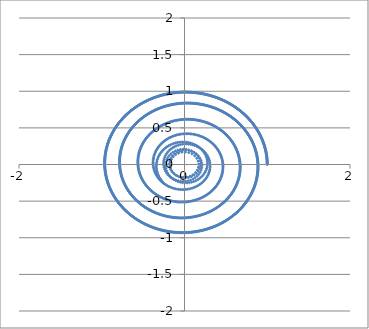
| Category | Series 0 |
|---|---|
| 1.0 | 0 |
| 0.999949643186176 | 0.007 |
| 0.9998489269966271 | 0.014 |
| 0.9996978513534557 | 0.021 |
| 0.9994964186635414 | 0.028 |
| 0.9992446338192059 | 0.035 |
| 0.9989425041987675 | 0.042 |
| 0.9985900396669872 | 0.05 |
| 0.9981872525754041 | 0.057 |
| 0.9977341577625616 | 0.064 |
| 0.9972307725541238 | 0.071 |
| 0.9966771167628822 | 0.078 |
| 0.9960732126886513 | 0.085 |
| 0.9954190851180562 | 0.092 |
| 0.9947147613242082 | 0.099 |
| 0.9939602710662717 | 0.106 |
| 0.9931556465889201 | 0.113 |
| 0.9923009226216816 | 0.12 |
| 0.9913961363781754 | 0.127 |
| 0.9904413275552368 | 0.134 |
| 0.9894365383319326 | 0.141 |
| 0.9883818133684653 | 0.148 |
| 0.9872771998049682 | 0.155 |
| 0.9861227472601889 | 0.162 |
| 0.9849185078300632 | 0.169 |
| 0.983664536086178 | 0.176 |
| 0.982360889074124 | 0.183 |
| 0.9810076263117382 | 0.19 |
| 0.9796048097872353 | 0.197 |
| 0.9781525039572291 | 0.204 |
| 0.9766507757446435 | 0.211 |
| 0.975099694536513 | 0.218 |
| 0.9734993321816721 | 0.225 |
| 0.9718497629883354 | 0.231 |
| 0.9701510637215665 | 0.238 |
| 0.9684033136006366 | 0.245 |
| 0.9666065942962733 | 0.252 |
| 0.964760989927798 | 0.259 |
| 0.9628665870601543 | 0.266 |
| 0.960923474700825 | 0.273 |
| 0.9589317442966395 | 0.279 |
| 0.9568914897304714 | 0.286 |
| 0.9548028073178247 | 0.293 |
| 0.9526657958033112 | 0.3 |
| 0.9504805563570172 | 0.306 |
| 0.9482471925707607 | 0.313 |
| 0.9459658104542383 | 0.32 |
| 0.9436365184310626 | 0.327 |
| 0.9412594273346893 | 0.333 |
| 0.9388346504042355 | 0.34 |
| 0.9363623032801881 | 0.346 |
| 0.933842504000002 | 0.353 |
| 0.9312753729935898 | 0.36 |
| 0.9286610330787017 | 0.366 |
| 0.9259996094561967 | 0.373 |
| 0.9232912297052036 | 0.379 |
| 0.9205360237781742 | 0.386 |
| 0.9177341239958269 | 0.392 |
| 0.9148856650419814 | 0.399 |
| 0.9119907839582855 | 0.405 |
| 0.9090496201388322 | 0.412 |
| 0.9060623153246693 | 0.418 |
| 0.9030290135982003 | 0.425 |
| 0.899949861377477 | 0.431 |
| 0.8968250074103844 | 0.438 |
| 0.8936546027687174 | 0.444 |
| 0.8904388008421499 | 0.45 |
| 0.8871777573320958 | 0.456 |
| 0.8838716302454637 | 0.463 |
| 0.8805205798883027 | 0.469 |
| 0.8771247688593425 | 0.475 |
| 0.8736843620434257 | 0.481 |
| 0.8701995266048331 | 0.488 |
| 0.8666704319805034 | 0.494 |
| 0.863097249873145 | 0.5 |
| 0.8594801542442425 | 0.506 |
| 0.855819321306957 | 0.512 |
| 0.8521149295189201 | 0.518 |
| 0.8483671595749221 | 0.524 |
| 0.8445761943994954 | 0.53 |
| 0.8407422191393914 | 0.536 |
| 0.8368654211559534 | 0.542 |
| 0.8329459900173838 | 0.548 |
| 0.8289841174909066 | 0.554 |
| 0.8249799975348262 | 0.56 |
| 0.8209338262904807 | 0.566 |
| 0.8168458020740921 | 0.571 |
| 0.8127161253685119 | 0.577 |
| 0.8085449988148637 | 0.583 |
| 0.8043326272040823 | 0.589 |
| 0.800079217468349 | 0.594 |
| 0.7957849786724249 | 0.6 |
| 0.7914501220048812 | 0.606 |
| 0.7870748607692267 | 0.611 |
| 0.7826594103749338 | 0.617 |
| 0.7782039883283619 | 0.622 |
| 0.7737088142235798 | 0.628 |
| 0.7691741097330865 | 0.633 |
| 0.7646000985984306 | 0.639 |
| 0.7599870066207293 | 0.644 |
| 0.7553350616510865 | 0.649 |
| 0.7506444935809111 | 0.655 |
| 0.7459155343321346 | 0.66 |
| 0.7411484178473298 | 0.665 |
| 0.7363433800797291 | 0.671 |
| 0.7315006589831451 | 0.676 |
| 0.726620494501791 | 0.681 |
| 0.7217031285600033 | 0.686 |
| 0.7167488050518659 | 0.691 |
| 0.7117577698307368 | 0.696 |
| 0.7067302706986766 | 0.701 |
| 0.7016665573957803 | 0.706 |
| 0.696566881589412 | 0.711 |
| 0.691431496863343 | 0.716 |
| 0.6862606587067933 | 0.721 |
| 0.6810546245033778 | 0.726 |
| 0.6758136535199568 | 0.731 |
| 0.6705380068953907 | 0.735 |
| 0.6652279476292001 | 0.74 |
| 0.6598837405701322 | 0.745 |
| 0.6545056524046314 | 0.75 |
| 0.6490939516452174 | 0.754 |
| 0.6436489086187693 | 0.759 |
| 0.6381707954547169 | 0.763 |
| 0.6326598860731386 | 0.768 |
| 0.6271164561727679 | 0.772 |
| 0.6215407832189074 | 0.777 |
| 0.615933146431251 | 0.781 |
| 0.6102938267716155 | 0.785 |
| 0.604623106931581 | 0.79 |
| 0.5989212713200408 | 0.794 |
| 0.593188606050662 | 0.798 |
| 0.5874253989292554 | 0.802 |
| 0.5816319394410568 | 0.806 |
| 0.57580851873792 | 0.811 |
| 0.5699554296254205 | 0.815 |
| 0.5640729665498713 | 0.819 |
| 0.5581614255852524 | 0.823 |
| 0.5522211044200515 | 0.827 |
| 0.5462523023440191 | 0.83 |
| 0.5402553202348374 | 0.834 |
| 0.5342304605447021 | 0.838 |
| 0.528178027286821 | 0.842 |
| 0.5220983260218254 | 0.846 |
| 0.5159916638440988 | 0.849 |
| 0.5098583493680205 | 0.853 |
| 0.5036986927141262 | 0.856 |
| 0.49751300549518473 | 0.86 |
| 0.4913016008021937 | 0.863 |
| 0.485064793190291 | 0.867 |
| 0.47880289866458603 | 0.87 |
| 0.4725162346659092 | 0.874 |
| 0.46620512005648057 | 0.877 |
| 0.45986987510549854 | 0.88 |
| 0.4535108214746484 | 0.883 |
| 0.4471282822035319 | 0.887 |
| 0.4407225816950179 | 0.89 |
| 0.4342940457005146 | 0.893 |
| 0.4278430013051643 | 0.896 |
| 0.42136977691296035 | 0.899 |
| 0.4148747022317881 | 0.902 |
| 0.40835810825838853 | 0.905 |
| 0.4018203272632473 | 0.908 |
| 0.39526169277540746 | 0.91 |
| 0.38868253956720844 | 0.913 |
| 0.38208320363894993 | 0.916 |
| 0.37546402220348296 | 0.918 |
| 0.3688253336707273 | 0.921 |
| 0.3621674776321163 | 0.924 |
| 0.3554907948449703 | 0.926 |
| 0.3487956272167977 | 0.929 |
| 0.3420823177895256 | 0.931 |
| 0.3353512107236601 | 0.933 |
| 0.3286026512823765 | 0.936 |
| 0.3218369858155403 | 0.938 |
| 0.3150545617436599 | 0.94 |
| 0.30825572754177033 | 0.942 |
| 0.3014408327232503 | 0.945 |
| 0.2946102278235717 | 0.947 |
| 0.28776426438398295 | 0.949 |
| 0.28090329493512634 | 0.951 |
| 0.2740276729805903 | 0.953 |
| 0.2671377529803968 | 0.954 |
| 0.26023389033442523 | 0.956 |
| 0.25331644136577186 | 0.958 |
| 0.2463857633040474 | 0.96 |
| 0.23944221426861173 | 0.961 |
| 0.23248615325174715 | 0.963 |
| 0.22551794010177062 | 0.965 |
| 0.2185379355060855 | 0.966 |
| 0.2115465009741735 | 0.968 |
| 0.20454399882052743 | 0.969 |
| 0.1975307921475255 | 0.97 |
| 0.19050724482824744 | 0.972 |
| 0.1834737214892335 | 0.973 |
| 0.17643058749318677 | 0.974 |
| 0.16937820892161942 | 0.975 |
| 0.1623169525574435 | 0.977 |
| 0.15524718586750705 | 0.978 |
| 0.14816927698507618 | 0.979 |
| 0.1410835946922635 | 0.98 |
| 0.13399050840240403 | 0.981 |
| 0.1268903881423787 | 0.981 |
| 0.1197836045348866 | 0.982 |
| 0.11267052878066622 | 0.983 |
| 0.10555153264066676 | 0.984 |
| 0.09842698841816981 | 0.984 |
| 0.09129726894086235 | 0.985 |
| 0.0841627475428615 | 0.986 |
| 0.077023798046692 | 0.986 |
| 0.06988079474521683 | 0.986 |
| 0.06273411238352179 | 0.987 |
| 0.05558412614075477 | 0.987 |
| 0.04843121161192022 | 0.988 |
| 0.0412757447896298 | 0.988 |
| 0.03411810204580966 | 0.988 |
| 0.026958660113365143 | 0.988 |
| 0.019797796067803686 | 0.988 |
| 0.012635887308816507 | 0.988 |
| 0.00547331154181989 | 0.988 |
| -0.001689553240543264 | 0.988 |
| -0.008852328776940893 | 0.988 |
| -0.016014636555927494 | 0.988 |
| -0.023176097834557423 | 0.988 |
| -0.030336333657034982 | 0.987 |
| -0.037494964873400635 | 0.987 |
| -0.04465161215825255 | 0.987 |
| -0.05180589602950279 | 0.986 |
| -0.05895743686716735 | 0.986 |
| -0.06610585493218932 | 0.985 |
| -0.0732507703852945 | 0.985 |
| -0.08039180330587856 | 0.984 |
| -0.08752857371092514 | 0.983 |
| -0.09466070157395405 | 0.982 |
| -0.10178780684399885 | 0.982 |
| -0.108909509464613 | 0.981 |
| -0.11602542939290392 | 0.98 |
| -0.123135186618594 | 0.979 |
| -0.1302384011831081 | 0.978 |
| -0.1373346931986863 | 0.977 |
| -0.14442368286752172 | 0.976 |
| -0.15150499050092203 | 0.975 |
| -0.15857823653849434 | 0.973 |
| -0.16564304156735238 | 0.972 |
| -0.17269902634134532 | 0.971 |
| -0.17974581180030746 | 0.969 |
| -0.18678301908932793 | 0.968 |
| -0.19381026957803957 | 0.967 |
| -0.20082718487992635 | 0.965 |
| -0.2078333868716483 | 0.963 |
| -0.21482849771238338 | 0.962 |
| -0.22181213986318538 | 0.96 |
| -0.22878393610635686 | 0.958 |
| -0.23574350956483678 | 0.957 |
| -0.24269048372160143 | 0.955 |
| -0.2496244824390784 | 0.953 |
| -0.2565451299785722 | 0.951 |
| -0.2634520510197013 | 0.949 |
| -0.2703448706798454 | 0.947 |
| -0.277223214533602 | 0.945 |
| -0.2840867086322517 | 0.943 |
| -0.2909349795232317 | 0.941 |
| -0.29776765426961566 | 0.938 |
| -0.3045843604695999 | 0.936 |
| -0.3113847262759954 | 0.934 |
| -0.31816838041572343 | 0.931 |
| -0.3249349522093156 | 0.929 |
| -0.33168407159041613 | 0.926 |
| -0.3384153691252861 | 0.924 |
| -0.34512847603230923 | 0.921 |
| -0.3518230242014973 | 0.919 |
| -0.35849864621399535 | 0.916 |
| -0.36515497536158503 | 0.913 |
| -0.371791645666186 | 0.91 |
| -0.3784082918993537 | 0.908 |
| -0.38500454960177344 | 0.905 |
| -0.3915800551027492 | 0.902 |
| -0.3981344455396868 | 0.899 |
| -0.4046673588775703 | 0.896 |
| -0.411178433928431 | 0.893 |
| -0.4176673103708077 | 0.889 |
| -0.4241336287691978 | 0.886 |
| -0.43057703059349856 | 0.883 |
| -0.43699715823843654 | 0.88 |
| -0.4433936550429858 | 0.876 |
| -0.44976616530977265 | 0.873 |
| -0.4561143343244674 | 0.87 |
| -0.4624378083751607 | 0.866 |
| -0.46873623477172477 | 0.863 |
| -0.4750092618651584 | 0.859 |
| -0.48125653906691424 | 0.856 |
| -0.4874777168682081 | 0.852 |
| -0.49367244685930933 | 0.848 |
| -0.4998403817488108 | 0.844 |
| -0.5059811753828783 | 0.841 |
| -0.5120944827644783 | 0.837 |
| -0.5181799600725824 | 0.833 |
| -0.5242372646813485 | 0.829 |
| -0.5302660551792777 | 0.825 |
| -0.5362659913883457 | 0.821 |
| -0.5422367343831074 | 0.817 |
| -0.5481779465097745 | 0.813 |
| -0.5540892914052652 | 0.809 |
| -0.5599704340162246 | 0.805 |
| -0.5658210406180149 | 0.8 |
| -0.571640778833675 | 0.796 |
| -0.5774293176528482 | 0.792 |
| -0.5831863274506767 | 0.787 |
| -0.588911480006663 | 0.783 |
| -0.5946044485234969 | 0.779 |
| -0.6002649076458454 | 0.774 |
| -0.6058925334791082 | 0.77 |
| -0.6114870036081346 | 0.765 |
| -0.6170479971159019 | 0.76 |
| -0.6225751946021553 | 0.756 |
| -0.6280682782020073 | 0.751 |
| -0.6335269316044956 | 0.746 |
| -0.6389508400710996 | 0.741 |
| -0.6443396904542132 | 0.737 |
| -0.6496931712155743 | 0.732 |
| -0.655010972444649 | 0.727 |
| -0.66029278587697 | 0.722 |
| -0.6655383049124288 | 0.717 |
| -0.6707472246335192 | 0.712 |
| -0.675919241823533 | 0.707 |
| -0.6810540549847061 | 0.702 |
| -0.6861513643563132 | 0.697 |
| -0.6912108719327124 | 0.691 |
| -0.6962322814813361 | 0.686 |
| -0.7012152985606291 | 0.681 |
| -0.7061596305379327 | 0.676 |
| -0.711064986607313 | 0.67 |
| -0.7159310778073329 | 0.665 |
| -0.7207576170387677 | 0.66 |
| -0.725544319082262 | 0.654 |
| -0.7302909006159275 | 0.649 |
| -0.734997080232881 | 0.643 |
| -0.7396625784587217 | 0.638 |
| -0.7442871177689461 | 0.632 |
| -0.7488704226062998 | 0.626 |
| -0.7534122193980665 | 0.621 |
| -0.7579122365732914 | 0.615 |
| -0.7623702045799393 | 0.609 |
| -0.7667858559019853 | 0.604 |
| -0.771158925076439 | 0.598 |
| -0.7754891487102991 | 0.592 |
| -0.7797762654974386 | 0.586 |
| -0.7840200162354207 | 0.58 |
| -0.7882201438422414 | 0.574 |
| -0.7923763933730006 | 0.568 |
| -0.7964885120365004 | 0.562 |
| -0.800556249211768 | 0.556 |
| -0.804579356464504 | 0.55 |
| -0.8085575875634539 | 0.544 |
| -0.8124906984967033 | 0.538 |
| -0.8163784474878941 | 0.532 |
| -0.820220595012362 | 0.526 |
| -0.8240169038131936 | 0.52 |
| -0.8277671389172031 | 0.513 |
| -0.8314710676508265 | 0.507 |
| -0.8351284596559329 | 0.501 |
| -0.8387390869055522 | 0.495 |
| -0.8423027237195179 | 0.488 |
| -0.8458191467800236 | 0.482 |
| -0.8492881351470936 | 0.475 |
| -0.8527094702739652 | 0.469 |
| -0.8560829360223826 | 0.463 |
| -0.859408318677801 | 0.456 |
| -0.8626854069645002 | 0.45 |
| -0.8659139920606073 | 0.443 |
| -0.8690938676130252 | 0.437 |
| -0.8722248297522702 | 0.43 |
| -0.8753066771072133 | 0.423 |
| -0.8783392108197267 | 0.417 |
| -0.8813222345592342 | 0.41 |
| -0.8842555545371648 | 0.403 |
| -0.8871389795213072 | 0.397 |
| -0.889972320850066 | 0.39 |
| -0.8927553924466173 | 0.383 |
| -0.895488010832964 | 0.377 |
| -0.8981699951438885 | 0.37 |
| -0.9008011671408026 | 0.363 |
| -0.9033813512254942 | 0.356 |
| -0.9059103744537687 | 0.349 |
| -0.9083880665489845 | 0.342 |
| -0.9108142599154831 | 0.336 |
| -0.9131887896519099 | 0.329 |
| -0.9155114935644276 | 0.322 |
| -0.9177822121798204 | 0.315 |
| -0.9200007887584868 | 0.308 |
| -0.9221670693073222 | 0.301 |
| -0.9242809025924884 | 0.294 |
| -0.9263421401520706 | 0.287 |
| -0.9283506363086201 | 0.28 |
| -0.9303062481815818 | 0.273 |
| -0.932208835699606 | 0.266 |
| -0.9340582616127435 | 0.259 |
| -0.9358543915045227 | 0.252 |
| -0.9375970938039077 | 0.245 |
| -0.9392862397971378 | 0.238 |
| -0.9409217036394456 | 0.23 |
| -0.9425033623666541 | 0.223 |
| -0.9440310959066509 | 0.216 |
| -0.9455047870907403 | 0.209 |
| -0.9469243216648697 | 0.202 |
| -0.948289588300733 | 0.195 |
| -0.9496004786067455 | 0.187 |
| -0.9508568871388944 | 0.18 |
| -0.9520587114114598 | 0.173 |
| -0.9532058519076082 | 0.166 |
| -0.9542982120898555 | 0.159 |
| -0.9553356984104004 | 0.151 |
| -0.9563182203213261 | 0.144 |
| -0.9572456902846695 | 0.137 |
| -0.9581180237823583 | 0.129 |
| -0.9589351393260127 | 0.122 |
| -0.9596969584666136 | 0.115 |
| -0.9604034058040345 | 0.108 |
| -0.9610544089964362 | 0.1 |
| -0.9616498987695256 | 0.093 |
| -0.9621898089256742 | 0.086 |
| -0.9626740763528994 | 0.078 |
| -0.9631026410337038 | 0.071 |
| -0.9634754460537754 | 0.064 |
| -0.9637924376105446 | 0.056 |
| -0.964053565021599 | 0.049 |
| -0.9642587807329555 | 0.042 |
| -0.9644080403271866 | 0.034 |
| -0.9645013025314032 | 0.027 |
| -0.9645385292250898 | 0.02 |
| -0.9645196854477935 | 0.012 |
| -0.9644447394066664 | 0.005 |
| -0.9643136624838572 | -0.002 |
| -0.9641264292437555 | -0.01 |
| -0.9638830174400848 | -0.017 |
| -0.963583408022845 | -0.024 |
| -0.9632275851451031 | -0.032 |
| -0.9628155361696307 | -0.039 |
| -0.9623472516753888 | -0.046 |
| -0.9618227254638582 | -0.054 |
| -0.9612419545652141 | -0.061 |
| -0.9606049392443462 | -0.068 |
| -0.9599116830067209 | -0.076 |
| -0.9591621926040869 | -0.083 |
| -0.958356478040022 | -0.09 |
| -0.9574945525753217 | -0.097 |
| -0.9565764327332269 | -0.105 |
| -0.9556021383044923 | -0.112 |
| -0.9545716923522923 | -0.119 |
| -0.9534851212169657 | -0.127 |
| -0.9523424545205972 | -0.134 |
| -0.9511437251714349 | -0.141 |
| -0.9498889693681444 | -0.148 |
| -0.9485782266038969 | -0.156 |
| -0.9472115396702918 | -0.163 |
| -0.9457889546611128 | -0.17 |
| -0.9443105209759164 | -0.177 |
| -0.9427762913234526 | -0.185 |
| -0.9411863217249167 | -0.192 |
| -0.9395406715170311 | -0.199 |
| -0.9378394033549583 | -0.206 |
| -0.9360825832150411 | -0.213 |
| -0.9342702803973726 | -0.22 |
| -0.9324025675281931 | -0.228 |
| -0.9304795205621141 | -0.235 |
| -0.9285012187841691 | -0.242 |
| -0.9264677448116889 | -0.249 |
| -0.9243791845960028 | -0.256 |
| -0.9222356274239634 | -0.263 |
| -0.9200371659192953 | -0.27 |
| -0.9177838960437668 | -0.277 |
| -0.9154759170981829 | -0.284 |
| -0.9131133317232013 | -0.291 |
| -0.9106962458999682 | -0.298 |
| -0.9082247689505748 | -0.305 |
| -0.9056990135383333 | -0.312 |
| -0.903119095667872 | -0.319 |
| -0.9004851346850489 | -0.326 |
| -0.897797253276683 | -0.333 |
| -0.8950555774701024 | -0.34 |
| -0.8922602366325094 | -0.346 |
| -0.8894113634701611 | -0.353 |
| -0.8865090940273661 | -0.36 |
| -0.8835535676852949 | -0.367 |
| -0.8805449271606053 | -0.374 |
| -0.877483318503881 | -0.38 |
| -0.8743688910978831 | -0.387 |
| -0.8712017976556146 | -0.394 |
| -0.8679821942181962 | -0.4 |
| -0.8647102401525538 | -0.407 |
| -0.8613860981489165 | -0.414 |
| -0.8580099342181252 | -0.42 |
| -0.8545819176887505 | -0.427 |
| -0.8511022212040203 | -0.433 |
| -0.8475710207185558 | -0.44 |
| -0.8439884954949154 | -0.446 |
| -0.8403548280999467 | -0.453 |
| -0.8366702044009454 | -0.459 |
| -0.8329348135616215 | -0.466 |
| -0.8291488480378703 | -0.472 |
| -0.8253125035733505 | -0.478 |
| -0.821425979194867 | -0.485 |
| -0.8174894772075583 | -0.491 |
| -0.8135032031898882 | -0.497 |
| -0.8094673659884424 | -0.504 |
| -0.8053821777125265 | -0.51 |
| -0.8012478537285694 | -0.516 |
| -0.7970646126543274 | -0.522 |
| -0.7928326763528911 | -0.528 |
| -0.7885522699264947 | -0.534 |
| -0.7842236217101255 | -0.54 |
| -0.779846963264935 | -0.546 |
| -0.7754225293714506 | -0.552 |
| -0.7709505580225875 | -0.558 |
| -0.7664312904164601 | -0.564 |
| -0.7618649709489929 | -0.57 |
| -0.7572518472063311 | -0.576 |
| -0.7525921699570491 | -0.582 |
| -0.7478861931441583 | -0.587 |
| -0.7431341738769118 | -0.593 |
| -0.7383363724224086 | -0.599 |
| -0.7334930521969932 | -0.605 |
| -0.7286044797574546 | -0.61 |
| -0.7236709247920199 | -0.616 |
| -0.7186926601111464 | -0.621 |
| -0.7136699616381088 | -0.627 |
| -0.7086031083993829 | -0.632 |
| -0.7034923825148248 | -0.638 |
| -0.6983380691876463 | -0.643 |
| -0.6931404566941846 | -0.648 |
| -0.6878998363734677 | -0.654 |
| -0.6826165026165748 | -0.659 |
| -0.6772907528557904 | -0.664 |
| -0.6719228875535541 | -0.669 |
| -0.6665132101912031 | -0.675 |
| -0.6610620272575102 | -0.68 |
| -0.6555696482370146 | -0.685 |
| -0.650036385598147 | -0.69 |
| -0.644462554781148 | -0.695 |
| -0.6388484741857796 | -0.7 |
| -0.6331944651588303 | -0.705 |
| -0.6275008519814134 | -0.709 |
| -0.6217679618560579 | -0.714 |
| -0.6159961248935927 | -0.719 |
| -0.610185674099823 | -0.724 |
| -0.6043369453620004 | -0.728 |
| -0.5984502774350844 | -0.733 |
| -0.5925260119277971 | -0.737 |
| -0.5865644932884707 | -0.742 |
| -0.580566068790687 | -0.746 |
| -0.5745310885187088 | -0.751 |
| -0.5684599053527052 | -0.755 |
| -0.5623528749537674 | -0.76 |
| -0.5562103557487187 | -0.764 |
| -0.5500327089147151 | -0.768 |
| -0.5438202983636399 | -0.772 |
| -0.5375734907262891 | -0.776 |
| -0.5312926553363511 | -0.781 |
| -0.5249781642141769 | -0.785 |
| -0.5186303920503446 | -0.789 |
| -0.5122497161890152 | -0.793 |
| -0.505836516611082 | -0.796 |
| -0.4993911759171124 | -0.8 |
| -0.4929140793100825 | -0.804 |
| -0.48640561457790504 | -0.808 |
| -0.4798661720757502 | -0.812 |
| -0.47329614470816 | -0.815 |
| -0.46669592791095565 | -0.819 |
| -0.460065919632939 | -0.822 |
| -0.4534065203173875 | -0.826 |
| -0.44671813288334294 | -0.829 |
| -0.44000116270669487 | -0.833 |
| -0.43325601760105775 | -0.836 |
| -0.4264831077984432 | -0.839 |
| -0.4196828459297266 | -0.842 |
| -0.41285564700490923 | -0.846 |
| -0.4060019283931752 | -0.849 |
| -0.39912210980274454 | -0.852 |
| -0.3922166132605214 | -0.855 |
| -0.3852858630915392 | -0.858 |
| -0.37833028589820183 | -0.861 |
| -0.37135031053932144 | -0.863 |
| -0.3643463681089537 | -0.866 |
| -0.35731889191503047 | -0.869 |
| -0.35026831745779 | -0.872 |
| -0.34319508240800567 | -0.874 |
| -0.33609962658501286 | -0.877 |
| -0.3289823919345352 | -0.879 |
| -0.32184382250630994 | -0.882 |
| -0.3146843644315131 | -0.884 |
| -0.307504465899985 | -0.886 |
| -0.30030457713725606 | -0.889 |
| -0.2930851503813743 | -0.891 |
| -0.2858466398595338 | -0.893 |
| -0.27858950176450575 | -0.895 |
| -0.2713141942308719 | -0.897 |
| -0.2640211773110608 | -0.899 |
| -0.25671091295118814 | -0.901 |
| -0.24938386496670095 | -0.903 |
| -0.24204049901782657 | -0.905 |
| -0.2346812825848269 | -0.906 |
| -0.2273066849430585 | -0.908 |
| -0.21991717713783912 | -0.91 |
| -0.21251323195912133 | -0.911 |
| -0.20509532391597382 | -0.913 |
| -0.19766392921087095 | -0.914 |
| -0.1902195257137914 | -0.916 |
| -0.18276259293612626 | -0.917 |
| -0.1752936120043977 | -0.918 |
| -0.1678130656337883 | -0.919 |
| -0.16032143810148244 | -0.92 |
| -0.15281921521981987 | -0.922 |
| -0.1453068843092625 | -0.923 |
| -0.1377849341711753 | -0.923 |
| -0.13025385506042156 | -0.924 |
| -0.12271413865777393 | -0.925 |
| -0.11516627804214147 | -0.926 |
| -0.10761076766261392 | -0.927 |
| -0.10004810331032381 | -0.927 |
| -0.09247878209012733 | -0.928 |
| -0.08490330239210472 | -0.928 |
| -0.07732216386288122 | -0.929 |
| -0.06973586737676922 | -0.929 |
| -0.06214491500673277 | -0.93 |
| -0.05454980999517519 | -0.93 |
| -0.04695105672455075 | -0.93 |
| -0.03934916068780139 | -0.93 |
| -0.03174462845861943 | -0.93 |
| -0.024137967661537207 | -0.93 |
| -0.0165296869418447 | -0.93 |
| -0.008920295935336109 | -0.93 |
| -0.0013103052378863628 | -0.93 |
| 0.0062997736251412945 | -0.93 |
| 0.013909428229655683 | -0.93 |
| 0.021518145283764938 | -0.929 |
| 0.029125410658869515 | -0.929 |
| 0.036730709420919896 | -0.928 |
| 0.04433352586183784 | -0.928 |
| 0.0519333435311001 | -0.927 |
| 0.059529645267483375 | -0.927 |
| 0.06712191323096942 | -0.926 |
| 0.07470962893480906 | -0.925 |
| 0.08229227327774402 | -0.924 |
| 0.0898693265763852 | -0.923 |
| 0.0974402685977463 | -0.922 |
| 0.10500457859193146 | -0.921 |
| 0.11256173532497582 | -0.92 |
| 0.12011121711183743 | -0.919 |
| 0.12765250184953952 | -0.918 |
| 0.13518506705046157 | -0.916 |
| 0.1427083898757781 | -0.915 |
| 0.15022194716904366 | -0.914 |
| 0.15772521548992258 | -0.912 |
| 0.1652176711480624 | -0.911 |
| 0.1726987902371094 | -0.909 |
| 0.1801680486688647 | -0.907 |
| 0.1876249222075798 | -0.906 |
| 0.19506888650438978 | -0.904 |
| 0.2024994171318831 | -0.902 |
| 0.2099159896188061 | -0.9 |
| 0.21731807948490095 | -0.898 |
| 0.22470516227587567 | -0.896 |
| 0.23207671359850418 | -0.894 |
| 0.23943220915585542 | -0.892 |
| 0.2467711247826497 | -0.89 |
| 0.25409293648074066 | -0.887 |
| 0.26139712045472124 | -0.885 |
| 0.2686831531476524 | -0.883 |
| 0.2759505112769123 | -0.88 |
| 0.2831986718701648 | -0.878 |
| 0.2904271123014458 | -0.875 |
| 0.29763531032736484 | -0.872 |
| 0.30482274412342136 | -0.87 |
| 0.31198889232043286 | -0.867 |
| 0.31913323404107435 | -0.864 |
| 0.3262552489365262 | -0.861 |
| 0.3333544172232294 | -0.858 |
| 0.3404302197197461 | -0.855 |
| 0.3474821378837238 | -0.852 |
| 0.3545096538489612 | -0.849 |
| 0.36151225046257407 | -0.846 |
| 0.3684894113222588 | -0.843 |
| 0.3754406208136527 | -0.839 |
| 0.382365364147788 | -0.836 |
| 0.3892631273986385 | -0.832 |
| 0.3961333975407567 | -0.829 |
| 0.4029756624869992 | -0.825 |
| 0.40978941112633865 | -0.822 |
| 0.4165741333617605 | -0.818 |
| 0.4233293201482419 | -0.814 |
| 0.4300544635308113 | -0.811 |
| 0.4367490566826865 | -0.807 |
| 0.4434125939434892 | -0.803 |
| 0.4500445708575338 | -0.799 |
| 0.45664448421218834 | -0.795 |
| 0.46321183207630584 | -0.791 |
| 0.46974611383872356 | -0.787 |
| 0.47624683024682807 | -0.782 |
| 0.48271348344518394 | -0.778 |
| 0.4891455770142244 | -0.774 |
| 0.4955426160090007 | -0.77 |
| 0.5019041069979892 | -0.765 |
| 0.5082295581019527 | -0.761 |
| 0.5145184790328553 | -0.756 |
| 0.5207703811328266 | -0.752 |
| 0.5269847774131746 | -0.747 |
| 0.5331611825934444 | -0.742 |
| 0.5392991131405196 | -0.738 |
| 0.5453980873077662 | -0.733 |
| 0.5514576251742137 | -0.728 |
| 0.5574772486837736 | -0.723 |
| 0.563456481684491 | -0.718 |
| 0.5693948499678292 | -0.713 |
| 0.5752918813079813 | -0.708 |
| 0.5811471055012105 | -0.703 |
| 0.5869600544052135 | -0.698 |
| 0.5927302619785055 | -0.693 |
| 0.5984572643198252 | -0.687 |
| 0.6041405997075553 | -0.682 |
| 0.6097798086391588 | -0.677 |
| 0.6153744338706251 | -0.671 |
| 0.6209240204559261 | -0.666 |
| 0.6264281157864788 | -0.66 |
| 0.6318862696306112 | -0.655 |
| 0.6372980341730295 | -0.649 |
| 0.642662964054284 | -0.644 |
| 0.6479806164102306 | -0.638 |
| 0.653250550911486 | -0.632 |
| 0.6584723298028722 | -0.626 |
| 0.6636455179428502 | -0.621 |
| 0.6687696828429378 | -0.615 |
| 0.6738443947071098 | -0.609 |
| 0.6788692264711774 | -0.603 |
| 0.6838437538421456 | -0.597 |
| 0.6887675553375422 | -0.591 |
| 0.6936402123247202 | -0.585 |
| 0.6984613090601268 | -0.579 |
| 0.7032304327285387 | -0.572 |
| 0.7079471734822589 | -0.566 |
| 0.7126111244802742 | -0.56 |
| 0.7172218819273687 | -0.554 |
| 0.721779045113191 | -0.547 |
| 0.7262822164512726 | -0.541 |
| 0.7307310015179934 | -0.534 |
| 0.7351250090914931 | -0.528 |
| 0.7394638511905235 | -0.521 |
| 0.7437471431132398 | -0.515 |
| 0.7479745034759283 | -0.508 |
| 0.7521455542516662 | -0.502 |
| 0.756259920808911 | -0.495 |
| 0.7603172319500174 | -0.488 |
| 0.7643171199496765 | -0.482 |
| 0.7682592205932762 | -0.475 |
| 0.7721431732151784 | -0.468 |
| 0.7759686207369109 | -0.461 |
| 0.779735209705269 | -0.454 |
| 0.7834425903303265 | -0.447 |
| 0.78709041652335 | -0.44 |
| 0.7906783459346147 | -0.433 |
| 0.7942060399911189 | -0.426 |
| 0.7976731639341925 | -0.419 |
| 0.801079386856998 | -0.412 |
| 0.8044243817419189 | -0.405 |
| 0.8077078254978338 | -0.398 |
| 0.8109293989972719 | -0.391 |
| 0.8140887871134467 | -0.384 |
| 0.8171856787571651 | -0.376 |
| 0.8202197669136079 | -0.369 |
| 0.8231907486789787 | -0.362 |
| 0.8260983252970177 | -0.355 |
| 0.8289422021953767 | -0.347 |
| 0.8317220890218531 | -0.34 |
| 0.8344376996804771 | -0.332 |
| 0.8370887523674515 | -0.325 |
| 0.8396749696069383 | -0.318 |
| 0.84219607828669 | -0.31 |
| 0.8446518096935213 | -0.303 |
| 0.8470418995486186 | -0.295 |
| 0.8493660880426831 | -0.287 |
| 0.8516241198709031 | -0.28 |
| 0.8538157442677546 | -0.272 |
| 0.8559407150416236 | -0.265 |
| 0.8579987906092488 | -0.257 |
| 0.8599897340299795 | -0.249 |
| 0.8619133130398464 | -0.242 |
| 0.863769300085441 | -0.234 |
| 0.8655574723575992 | -0.226 |
| 0.8672776118248879 | -0.219 |
| 0.868929505266888 | -0.211 |
| 0.8705129443072717 | -0.203 |
| 0.8720277254466711 | -0.195 |
| 0.8734736500953322 | -0.188 |
| 0.8748505246055531 | -0.18 |
| 0.8761581603039007 | -0.172 |
| 0.8773963735232029 | -0.164 |
| 0.8785649856343133 | -0.156 |
| 0.8796638230776432 | -0.148 |
| 0.8806927173944586 | -0.14 |
| 0.8816515052579369 | -0.133 |
| 0.8825400285039808 | -0.125 |
| 0.8833581341617851 | -0.117 |
| 0.8841056744841526 | -0.109 |
| 0.8847825069775547 | -0.101 |
| 0.8853884944319347 | -0.093 |
| 0.8859235049502473 | -0.085 |
| 0.8863874119777327 | -0.077 |
| 0.8867800943309205 | -0.069 |
| 0.8871014362263592 | -0.061 |
| 0.8873513273090681 | -0.053 |
| 0.8875296626807077 | -0.045 |
| 0.8876363429274637 | -0.037 |
| 0.8876712741476428 | -0.029 |
| 0.887634367978973 | -0.021 |
| 0.8875255416256081 | -0.013 |
| 0.8873447178848307 | -0.005 |
| 0.8870918251734489 | 0.003 |
| 0.8867667975538845 | 0.011 |
| 0.8863695747599485 | 0.018 |
| 0.885900102222298 | 0.026 |
| 0.8853583310935733 | 0.034 |
| 0.8847442182732093 | 0.042 |
| 0.8840577264319175 | 0.05 |
| 0.8832988240358359 | 0.058 |
| 0.8824674853703407 | 0.066 |
| 0.8815636905635174 | 0.074 |
| 0.8805874256092868 | 0.082 |
| 0.8795386823901821 | 0.09 |
| 0.8784174586997722 | 0.098 |
| 0.8772237582647284 | 0.106 |
| 0.8759575907665299 | 0.114 |
| 0.8746189718628035 | 0.122 |
| 0.8732079232082948 | 0.13 |
| 0.8717244724754655 | 0.138 |
| 0.8701686533747137 | 0.145 |
| 0.8685405056742128 | 0.153 |
| 0.8668400752193643 | 0.161 |
| 0.8650674139518623 | 0.169 |
| 0.8632225799283632 | 0.177 |
| 0.8613056373387585 | 0.185 |
| 0.8593166565240462 | 0.192 |
| 0.8572557139937954 | 0.2 |
| 0.855122892443202 | 0.208 |
| 0.8529182807697305 | 0.216 |
| 0.8506419740893374 | 0.223 |
| 0.8482940737522727 | 0.231 |
| 0.8458746873584562 | 0.239 |
| 0.8433839287724224 | 0.246 |
| 0.8408219181378322 | 0.254 |
| 0.8381887818915462 | 0.262 |
| 0.8354846527772551 | 0.269 |
| 0.8327096698586648 | 0.277 |
| 0.82986397853223 | 0.284 |
| 0.8269477305394347 | 0.292 |
| 0.8239610839786128 | 0.3 |
| 0.8209042033163071 | 0.307 |
| 0.8177772593981614 | 0.314 |
| 0.8145804294593422 | 0.322 |
| 0.8113138971344854 | 0.329 |
| 0.807977852467165 | 0.337 |
| 0.8045724919188785 | 0.344 |
| 0.8010980183775456 | 0.351 |
| 0.7975546411655168 | 0.359 |
| 0.7939425760470868 | 0.366 |
| 0.7902620452355097 | 0.373 |
| 0.7865132773995103 | 0.38 |
| 0.7826965076692906 | 0.387 |
| 0.778811977642024 | 0.394 |
| 0.7748599353868363 | 0.402 |
| 0.7708406354492666 | 0.409 |
| 0.7667543388552073 | 0.416 |
| 0.7626013131143166 | 0.423 |
| 0.7583818322229009 | 0.43 |
| 0.7540961766662635 | 0.436 |
| 0.7497446334205143 | 0.443 |
| 0.7453274959538381 | 0.45 |
| 0.7408450642272163 | 0.457 |
| 0.7362976446945998 | 0.464 |
| 0.7316855503025272 | 0.47 |
| 0.7270091004891865 | 0.477 |
| 0.7222686211829143 | 0.484 |
| 0.7174644448001314 | 0.49 |
| 0.712596910242708 | 0.497 |
| 0.7076663628947574 | 0.503 |
| 0.7026731546188524 | 0.51 |
| 0.697617643751662 | 0.516 |
| 0.6925001950990042 | 0.523 |
| 0.6873211799303106 | 0.529 |
| 0.6820809759725005 | 0.535 |
| 0.6767799674032592 | 0.541 |
| 0.6714185448437182 | 0.548 |
| 0.6659971053505331 | 0.554 |
| 0.6605160524073551 | 0.56 |
| 0.6549757959156933 | 0.566 |
| 0.6493767521851642 | 0.572 |
| 0.643719343923124 | 0.578 |
| 0.6380040002236813 | 0.583 |
| 0.6322311565560856 | 0.589 |
| 0.6264012547524893 | 0.595 |
| 0.6205147429950784 | 0.601 |
| 0.6145720758025693 | 0.606 |
| 0.6085737140160692 | 0.612 |
| 0.6025201247842936 | 0.618 |
| 0.5964117815481419 | 0.623 |
| 0.5902491640246237 | 0.628 |
| 0.5840327581901353 | 0.634 |
| 0.5777630562630818 | 0.639 |
| 0.5714405566858416 | 0.644 |
| 0.5650657641060708 | 0.65 |
| 0.5586391893573437 | 0.655 |
| 0.5521613494391264 | 0.66 |
| 0.5456327674960803 | 0.665 |
| 0.5390539727966924 | 0.67 |
| 0.5324255007112301 | 0.675 |
| 0.5257478926890158 | 0.68 |
| 0.5190216962350203 | 0.684 |
| 0.5122474648857702 | 0.689 |
| 0.5054257581845684 | 0.694 |
| 0.49855714165602183 | 0.698 |
| 0.4916421867798777 | 0.703 |
| 0.48468147096416125 | 0.707 |
| 0.47767557751761514 | 0.712 |
| 0.47062509562143634 | 0.716 |
| 0.4635306203003086 | 0.72 |
| 0.456392752392727 | 0.724 |
| 0.4492120985206127 | 0.728 |
| 0.44198927105821545 | 0.732 |
| 0.4347248881002999 | 0.736 |
| 0.42741957342961545 | 0.74 |
| 0.42007395648364515 | 0.744 |
| 0.4126886723206327 | 0.748 |
| 0.40526436158488427 | 0.752 |
| 0.3978016704713431 | 0.755 |
| 0.3903012506894353 | 0.759 |
| 0.382763759426183 | 0.762 |
| 0.3751898593085851 | 0.766 |
| 0.3675802183652608 | 0.769 |
| 0.3599355099873558 | 0.772 |
| 0.3522564128887088 | 0.775 |
| 0.3445436110652755 | 0.779 |
| 0.336797793753809 | 0.782 |
| 0.3290196553897948 | 0.785 |
| 0.3212098955646374 | 0.787 |
| 0.313369218982099 | 0.79 |
| 0.30549833541398597 | 0.793 |
| 0.2975979596550834 | 0.796 |
| 0.28966881147733553 | 0.798 |
| 0.2817116155832701 | 0.801 |
| 0.273727101558666 | 0.803 |
| 0.26571600382446176 | 0.806 |
| 0.25767906158790493 | 0.808 |
| 0.24961701879293968 | 0.81 |
| 0.2415306240698321 | 0.812 |
| 0.2334206306840322 | 0.814 |
| 0.22528779648427094 | 0.816 |
| 0.2171328838498917 | 0.818 |
| 0.20895665963741528 | 0.82 |
| 0.20075989512633696 | 0.822 |
| 0.19254336596415564 | 0.823 |
| 0.18430785211063344 | 0.825 |
| 0.17605413778128579 | 0.826 |
| 0.16778301139010085 | 0.828 |
| 0.15949526549148807 | 0.829 |
| 0.15119169672145513 | 0.83 |
| 0.1428731057380132 | 0.831 |
| 0.13454029716080979 | 0.832 |
| 0.12619407950998915 | 0.833 |
| 0.11783526514428008 | 0.834 |
| 0.10946467019831099 | 0.835 |
| 0.10108311451915203 | 0.836 |
| 0.0926914216020846 | 0.836 |
| 0.08429041852559818 | 0.837 |
| 0.07588093588561479 | 0.837 |
| 0.06746380772894126 | 0.838 |
| 0.059039871485949844 | 0.838 |
| 0.0506099679024875 | 0.838 |
| 0.042174940971014374 | 0.838 |
| 0.03373563786097225 | 0.838 |
| 0.025292908848383512 | 0.838 |
| 0.01684760724468152 | 0.838 |
| 0.008400589324773243 | 0.838 |
| -4.728574566484518e-05 | 0.838 |
| -0.008495155983656588 | 0.837 |
| -0.016942156663160478 | 0.837 |
| -0.025387420390067292 | 0.836 |
| -0.03383007717795966 | 0.836 |
| -0.04226925452463214 | 0.835 |
| -0.05070407748937028 | 0.834 |
| -0.05913366877098704 | 0.833 |
| -0.06755714878661478 | 0.832 |
| -0.0759736357512512 | 0.831 |
| -0.08438224575805693 | 0.83 |
| -0.09278209285940323 | 0.829 |
| -0.10117228914866724 | 0.828 |
| -0.10955194484277288 | 0.826 |
| -0.11792016836547482 | 0.825 |
| -0.12627606643138328 | 0.823 |
| -0.13461874413072702 | 0.821 |
| -0.1429473050148519 | 0.82 |
| -0.1512608511824522 | 0.818 |
| -0.15955848336653203 | 0.816 |
| -0.16783930102209357 | 0.814 |
| -0.17610240241454936 | 0.812 |
| -0.1843468847088551 | 0.81 |
| -0.19257184405936012 | 0.807 |
| -0.20077637570037152 | 0.805 |
| -0.20895957403742904 | 0.803 |
| -0.2171205327392866 | 0.8 |
| -0.2252583448305968 | 0.797 |
| -0.2333721027852947 | 0.795 |
| -0.24146089862067652 | 0.792 |
| -0.2495238239921697 | 0.789 |
| -0.2575599702887894 | 0.786 |
| -0.26556842872927744 | 0.783 |
| -0.2735482904589192 | 0.78 |
| -0.2814986466470339 | 0.777 |
| -0.2894185885851331 | 0.774 |
| -0.29730720778574315 | 0.77 |
| -0.30516359608188626 | 0.767 |
| -0.31298684572721486 | 0.763 |
| -0.32077604949679445 | 0.76 |
| -0.3285303007885293 | 0.756 |
| -0.3362486937252255 | 0.752 |
| -0.34393032325728556 | 0.748 |
| -0.35157428526602924 | 0.744 |
| -0.35917967666763395 | 0.74 |
| -0.3667455955176894 | 0.736 |
| -0.3742711411163599 | 0.732 |
| -0.3817554141141478 | 0.728 |
| -0.38919751661825225 | 0.723 |
| -0.39659655229951574 | 0.719 |
| -0.40395162649995264 | 0.714 |
| -0.41126184634085206 | 0.71 |
| -0.41852632083144825 | 0.705 |
| -0.42574416097815154 | 0.7 |
| -0.4329144798943322 | 0.695 |
| -0.4400363929106498 | 0.691 |
| -0.44710901768592054 | 0.686 |
| -0.45413147431851475 | 0.681 |
| -0.46110288545827627 | 0.675 |
| -0.4680223764189562 | 0.67 |
| -0.47488907529115254 | 0.665 |
| -0.48170211305574684 | 0.66 |
| -0.48846062369783033 | 0.654 |
| -0.4951637443211097 | 0.649 |
| -0.5018106152627846 | 0.643 |
| -0.5084003802088872 | 0.637 |
| -0.5149321863100751 | 0.632 |
| -0.5214051842978676 | 0.626 |
| -0.527818528601317 | 0.62 |
| -0.5341713774641033 | 0.614 |
| -0.5404628930620452 | 0.608 |
| -0.5466922416210148 | 0.602 |
| -0.5528585935352474 | 0.596 |
| -0.5589611234860351 | 0.589 |
| -0.5649990105607955 | 0.583 |
| -0.570971438372502 | 0.577 |
| -0.5768775951794675 | 0.57 |
| -0.5827166740054693 | 0.564 |
| -0.5884878727602042 | 0.557 |
| -0.5941903943600617 | 0.551 |
| -0.5998234468492062 | 0.544 |
| -0.605386243520953 | 0.537 |
| -0.6108780030394301 | 0.53 |
| -0.6162979495615095 | 0.524 |
| -0.6216453128590006 | 0.517 |
| -0.6269193284410887 | 0.51 |
| -0.6321192376770094 | 0.503 |
| -0.6372442879189446 | 0.495 |
| -0.6422937326251272 | 0.488 |
| -0.6472668314831421 | 0.481 |
| -0.6521628505334097 | 0.474 |
| -0.6569810622928383 | 0.466 |
| -0.6617207458786323 | 0.459 |
| -0.6663811871322423 | 0.451 |
| -0.6709616787434423 | 0.444 |
| -0.6754615203745208 | 0.436 |
| -0.6798800187845709 | 0.429 |
| -0.684216487953865 | 0.421 |
| -0.688470249208299 | 0.413 |
| -0.6926406313438919 | 0.406 |
| -0.6967269707513243 | 0.398 |
| -0.7007286115405026 | 0.39 |
| -0.7046449056651304 | 0.382 |
| -0.7084752130472746 | 0.374 |
| -0.7122189017019078 | 0.366 |
| -0.7158753478614127 | 0.358 |
| -0.7194439361000309 | 0.35 |
| -0.7229240594582402 | 0.342 |
| -0.7263151195670445 | 0.333 |
| -0.7296165267721578 | 0.325 |
| -0.7328277002580664 | 0.317 |
| -0.7359480681719522 | 0.309 |
| -0.7389770677474593 | 0.3 |
| -0.7419141454282854 | 0.292 |
| -0.7447587569915823 | 0.283 |
| -0.7475103676711458 | 0.275 |
| -0.7501684522803761 | 0.267 |
| -0.7527324953349938 | 0.258 |
| -0.7552019911754883 | 0.249 |
| -0.7575764440892833 | 0.241 |
| -0.7598553684325987 | 0.232 |
| -0.7620382887519906 | 0.224 |
| -0.7641247399055487 | 0.215 |
| -0.7661142671837333 | 0.206 |
| -0.768006426429831 | 0.197 |
| -0.7698007841600087 | 0.189 |
| -0.7714969176829477 | 0.18 |
| -0.7730944152190347 | 0.171 |
| -0.7745928760190914 | 0.162 |
| -0.7759919104826215 | 0.153 |
| -0.7772911402755531 | 0.145 |
| -0.7784901984474563 | 0.136 |
| -0.7795887295482146 | 0.127 |
| -0.7805863897441281 | 0.118 |
| -0.7814828469334273 | 0.109 |
| -0.7822777808611748 | 0.1 |
| -0.7829708832335338 | 0.091 |
| -0.7835618578313798 | 0.082 |
| -0.7840504206232345 | 0.073 |
| -0.7844362998774979 | 0.064 |
| -0.7847192362739557 | 0.055 |
| -0.7848989830145404 | 0.046 |
| -0.7849753059333211 | 0.037 |
| -0.7849479836056988 | 0.028 |
| -0.7848168074567848 | 0.019 |
| -0.7845815818689367 | 0.01 |
| -0.7842421242884287 | 0.001 |
| -0.7837982653312326 | -0.008 |
| -0.7832498488878835 | -0.017 |
| -0.7825967322274069 | -0.026 |
| -0.7818387861002816 | -0.035 |
| -0.7809758948404145 | -0.044 |
| -0.7800079564661007 | -0.053 |
| -0.7789348827799442 | -0.062 |
| -0.7777565994677141 | -0.071 |
| -0.7764730461961104 | -0.08 |
| -0.7750841767094117 | -0.089 |
| -0.7735899589249826 | -0.098 |
| -0.7719903750276107 | -0.107 |
| -0.7702854215626485 | -0.116 |
| -0.7684751095279337 | -0.125 |
| -0.7665594644644613 | -0.134 |
| -0.7645385265457788 | -0.143 |
| -0.76241235066608 | -0.151 |
| -0.7601810065269683 | -0.16 |
| -0.7578445787228625 | -0.169 |
| -0.7554031668250178 | -0.178 |
| -0.7528568854641341 | -0.187 |
| -0.7502058644115233 | -0.195 |
| -0.7474502486588079 | -0.204 |
| -0.7445901984961232 | -0.213 |
| -0.7416258895887932 | -0.221 |
| -0.7385575130524533 | -0.23 |
| -0.73538527552659 | -0.239 |
| -0.7321093992464697 | -0.247 |
| -0.7287301221134261 | -0.256 |
| -0.7252476977634797 | -0.264 |
| -0.721662395634257 | -0.273 |
| -0.7179745010301826 | -0.281 |
| -0.7141843151859131 | -0.289 |
| -0.7102921553279844 | -0.298 |
| -0.7062983547346414 | -0.306 |
| -0.7022032627938211 | -0.314 |
| -0.6980072450592586 | -0.323 |
| -0.6937106833046864 | -0.331 |
| -0.6893139755760963 | -0.339 |
| -0.6848175362420333 | -0.347 |
| -0.6802217960418925 | -0.355 |
| -0.675527202132186 | -0.363 |
| -0.6707342181307522 | -0.371 |
| -0.6658433241588735 | -0.379 |
| -0.6608550168812743 | -0.386 |
| -0.6557698095439674 | -0.394 |
| -0.6505882320099162 | -0.402 |
| -0.6453108307924852 | -0.409 |
| -0.6399381690866439 | -0.417 |
| -0.6344708267978953 | -0.424 |
| -0.6289094005688969 | -0.432 |
| -0.6232545038037423 | -0.439 |
| -0.6175067666898738 | -0.447 |
| -0.6116668362175922 | -0.454 |
| -0.6057353761971339 | -0.461 |
| -0.5997130672732834 | -0.468 |
| -0.5936006069374893 | -0.475 |
| -0.5873987095374524 | -0.482 |
| -0.5811081062841551 | -0.489 |
| -0.5747295452562983 | -0.496 |
| -0.5682637914021164 | -0.503 |
| -0.5617116265385377 | -0.509 |
| -0.5550738493476586 | -0.516 |
| -0.5483512753704995 | -0.522 |
| -0.5415447369980124 | -0.529 |
| -0.5346550834593058 | -0.535 |
| -0.5276831808070579 | -0.541 |
| -0.5206299119000853 | -0.547 |
| -0.5134961763830358 | -0.554 |
| -0.5062828906631732 | -0.56 |
| -0.4989909878842241 | -0.566 |
| -0.4916214178972536 | -0.571 |
| -0.4841751472285401 | -0.577 |
| -0.47665315904441646 | -0.583 |
| -0.4690564531130475 | -0.588 |
| -0.4613860457631121 | -0.594 |
| -0.4536429698393589 | -0.599 |
| -0.4458282746550053 | -0.604 |
| -0.43794302594094775 | -0.61 |
| -0.42998830579175396 | -0.615 |
| -0.4219652126084054 | -0.62 |
| -0.41387486103776067 | -0.625 |
| -0.40571838190870807 | -0.629 |
| -0.3974969221649787 | -0.634 |
| -0.3892116447945893 | -0.639 |
| -0.38086372875588476 | -0.643 |
| -0.37245436890015154 | -0.648 |
| -0.36398477589077194 | -0.652 |
| -0.3554561761188897 | -0.656 |
| -0.34686981161555885 | -0.66 |
| -0.338226939960346 | -0.664 |
| -0.3295288341863578 | -0.668 |
| -0.32077678268166576 | -0.672 |
| -0.3119720890870991 | -0.675 |
| -0.3031160721903791 | -0.679 |
| -0.2942100658165661 | -0.682 |
| -0.28525541871479304 | -0.685 |
| -0.27625349444125735 | -0.689 |
| -0.2672056712384456 | -0.692 |
| -0.25811334191056323 | -0.695 |
| -0.24897791369514452 | -0.697 |
| -0.239800808130816 | -0.7 |
| -0.2305834609211887 | -0.703 |
| -0.2213273217948535 | -0.705 |
| -0.21203385436145544 | -0.708 |
| -0.2027045359638222 | -0.71 |
| -0.19334085752612337 | -0.712 |
| -0.18394432339803649 | -0.714 |
| -0.17451645119489714 | -0.716 |
| -0.16505877163381033 | -0.718 |
| -0.15557282836570083 | -0.719 |
| -0.14606017780328104 | -0.721 |
| -0.1365223889449148 | -0.722 |
| -0.1269610431943567 | -0.723 |
| -0.11737773417634609 | -0.725 |
| -0.10777406754803685 | -0.726 |
| -0.0981516608062429 | -0.727 |
| -0.0885121430904812 | -0.727 |
| -0.07885715498179412 | -0.728 |
| -0.0691883482973335 | -0.728 |
| -0.05950738588068953 | -0.729 |
| -0.049815941387948114 | -0.729 |
| -0.04011569906946098 | -0.729 |
| -0.030408353547313523 | -0.729 |
| -0.020695609588475834 | -0.729 |
| -0.010979181873623322 | -0.729 |
| -0.001260794761613726 | -0.728 |
| 0.00845781795039176 | -0.728 |
| 0.018174913271174924 | -0.727 |
| 0.027888739264085406 | -0.726 |
| 0.0375975353000542 | -0.725 |
| 0.04729953231500509 | -0.724 |
| 0.05699295307167269 | -0.723 |
| 0.06667601242583475 | -0.722 |
| 0.07634691759696584 | -0.72 |
| 0.08600386844331828 | -0.719 |
| 0.0956450577414359 | -0.717 |
| 0.10526867147010457 | -0.715 |
| 0.11487288909874332 | -0.713 |
| 0.12445588388023845 | -0.711 |
| 0.13401582314822214 | -0.709 |
| 0.14355086861879635 | -0.707 |
| 0.15305917669670163 | -0.704 |
| 0.16253889878592953 | -0.702 |
| 0.1719881816047761 | -0.699 |
| 0.1814051675053333 | -0.696 |
| 0.19078799479741376 | -0.693 |
| 0.20013479807690343 | -0.69 |
| 0.20944370855853534 | -0.686 |
| 0.21871285441307686 | -0.683 |
| 0.22794036110892166 | -0.679 |
| 0.23712435175807586 | -0.676 |
| 0.24626294746652783 | -0.672 |
| 0.2553542676889884 | -0.668 |
| 0.2643964305879884 | -0.664 |
| 0.2733875533973184 | -0.66 |
| 0.2823257527897944 | -0.655 |
| 0.29120914524933156 | -0.651 |
| 0.30003584744730843 | -0.646 |
| 0.3088039766231996 | -0.642 |
| 0.3175116509694568 | -0.637 |
| 0.32615699002061516 | -0.632 |
| 0.3347381150465994 | -0.627 |
| 0.34325314945020535 | -0.622 |
| 0.35170021916872907 | -0.616 |
| 0.36007745307971434 | -0.611 |
| 0.36838298341078923 | -0.605 |
| 0.37661494615355934 | -0.6 |
| 0.3847714814815243 | -0.594 |
| 0.392850734171983 | -0.588 |
| 0.40085085403189114 | -0.582 |
| 0.40876999632763183 | -0.576 |
| 0.4166063222186613 | -0.569 |
| 0.4243579991949861 | -0.563 |
| 0.43202320151843054 | -0.557 |
| 0.43960011066764776 | -0.55 |
| 0.447086915786829 | -0.543 |
| 0.4544818141380618 | -0.536 |
| 0.46178301155728707 | -0.529 |
| 0.468988722913803 | -0.522 |
| 0.4760971725732616 | -0.515 |
| 0.4831065948641023 | -0.508 |
| 0.49001523454736406 | -0.5 |
| 0.49682134728981736 | -0.493 |
| 0.5035232001403533 | -0.485 |
| 0.510119072009567 | -0.478 |
| 0.5166072541524681 | -0.47 |
| 0.5229860506542532 | -0.462 |
| 0.5292537789190671 | -0.454 |
| 0.5354087701616839 | -0.446 |
| 0.5414493699020312 | -0.438 |
| 0.5473739384624838 | -0.429 |
| 0.5531808514678467 | -0.421 |
| 0.5588685003479462 | -0.413 |
| 0.5644352928427494 | -0.404 |
| 0.5698796535099229 | -0.395 |
| 0.5752000242347463 | -0.387 |
| 0.5803948647422899 | -0.378 |
| 0.5854626531117637 | -0.369 |
| 0.5904018862929448 | -0.36 |
| 0.5952110806245846 | -0.351 |
| 0.5998887723546991 | -0.342 |
| 0.6044335181626374 | -0.333 |
| 0.6088438956828273 | -0.323 |
| 0.6131185040300897 | -0.314 |
| 0.6172559643264129 | -0.305 |
| 0.6212549202290752 | -0.295 |
| 0.6251140384600019 | -0.285 |
| 0.6288320093362392 | -0.276 |
| 0.6324075473014265 | -0.266 |
| 0.6358393914581434 | -0.256 |
| 0.6391263061010087 | -0.247 |
| 0.6422670812504021 | -0.237 |
| 0.6452605331866793 | -0.227 |
| 0.6481055049847478 | -0.217 |
| 0.6508008670488669 | -0.207 |
| 0.653345517647534 | -0.197 |
| 0.6557383834483166 | -0.187 |
| 0.6579784200524836 | -0.176 |
| 0.6600646125292923 | -0.166 |
| 0.6619959759497781 | -0.156 |
| 0.6637715559198966 | -0.146 |
| 0.6653904291128607 | -0.135 |
| 0.666851703800516 | -0.125 |
| 0.6681545203835904 | -0.115 |
| 0.6692980519206571 | -0.104 |
| 0.6702815046556397 | -0.094 |
| 0.6711041185436922 | -0.083 |
| 0.6717651677752778 | -0.073 |
| 0.6722639612982722 | -0.063 |
| 0.6725998433379105 | -0.052 |
| 0.6727721939143959 | -0.042 |
| 0.6727804293579839 | -0.031 |
| 0.6726240028213532 | -0.02 |
| 0.6723024047890725 | -0.01 |
| 0.6718151635839676 | 0.001 |
| 0.6711618458701891 | 0.011 |
| 0.670342057152783 | 0.022 |
| 0.6693554422735567 | 0.032 |
| 0.6682016859030337 | 0.043 |
| 0.666880513028288 | 0.053 |
| 0.6653916894364416 | 0.064 |
| 0.6637350221936102 | 0.074 |
| 0.6619103601190768 | 0.085 |
| 0.6599175942544677 | 0.095 |
| 0.6577566583277081 | 0.105 |
| 0.6554275292115241 | 0.116 |
| 0.6529302273762606 | 0.126 |
| 0.6502648173367774 | 0.137 |
| 0.6474314080931863 | 0.147 |
| 0.644430153565185 | 0.157 |
| 0.6412612530197431 | 0.167 |
| 0.6379249514918924 | 0.177 |
| 0.6344215401983679 | 0.188 |
| 0.6307513569438468 | 0.198 |
| 0.6269147865195254 | 0.208 |
| 0.6229122610937753 | 0.218 |
| 0.6187442605946126 | 0.228 |
| 0.6144113130837138 | 0.237 |
| 0.6099139951217084 | 0.247 |
| 0.6052529321244755 | 0.257 |
| 0.6004287987101665 | 0.267 |
| 0.5954423190366767 | 0.276 |
| 0.5902942671292823 | 0.286 |
| 0.5849854671981597 | 0.295 |
| 0.579516793945496 | 0.304 |
| 0.5738891728619046 | 0.314 |
| 0.5681035805118476 | 0.323 |
| 0.5621610448077737 | 0.332 |
| 0.5560626452726686 | 0.341 |
| 0.5498095132907181 | 0.35 |
| 0.5434028323457815 | 0.359 |
| 0.5368438382473641 | 0.367 |
| 0.5301338193437855 | 0.376 |
| 0.5232741167222258 | 0.384 |
| 0.5162661243953414 | 0.393 |
| 0.5091112894741296 | 0.401 |
| 0.5018111123267263 | 0.409 |
| 0.4943671467228136 | 0.417 |
| 0.4867809999633175 | 0.425 |
| 0.4790543329950664 | 0.433 |
| 0.47118886051008796 | 0.441 |
| 0.463186351029212 | 0.448 |
| 0.45504862696965054 | 0.456 |
| 0.4467775646962221 | 0.463 |
| 0.4383750945558864 | 0.47 |
| 0.42984320089525374 | 0.477 |
| 0.4211839220607322 | 0.484 |
| 0.41239935038097447 | 0.49 |
| 0.40349163213128486 | 0.497 |
| 0.39446296747964543 | 0.503 |
| 0.3853156104140204 | 0.51 |
| 0.37605186865059587 | 0.516 |
| 0.3666741035226117 | 0.522 |
| 0.357184729849442 | 0.528 |
| 0.34758621578557986 | 0.533 |
| 0.3378810826491815 | 0.539 |
| 0.32807190472982545 | 0.544 |
| 0.3181613090751414 | 0.549 |
| 0.3081519752559644 | 0.554 |
| 0.29804663510966983 | 0.559 |
| 0.28784807246134503 | 0.564 |
| 0.2775591228224539 | 0.568 |
| 0.2671826730666523 | 0.572 |
| 0.25672166108241234 | 0.576 |
| 0.24617907540211487 | 0.58 |
| 0.2355579548072706 | 0.584 |
| 0.22486138790953306 | 0.588 |
| 0.2140925127071664 | 0.591 |
| 0.20325451611663464 | 0.594 |
| 0.19235063347898013 | 0.597 |
| 0.18138414804066177 | 0.6 |
| 0.17035839040852624 | 0.602 |
| 0.15927673797858777 | 0.605 |
| 0.14814261433829587 | 0.607 |
| 0.13695948864197308 | 0.609 |
| 0.12573087495910867 | 0.611 |
| 0.11446033159519817 | 0.612 |
| 0.1031514603848222 | 0.613 |
| 0.0918079059566635 | 0.615 |
| 0.0804333549701643 | 0.616 |
| 0.06903153532353251 | 0.616 |
| 0.057606215332809484 | 0.617 |
| 0.0461612028817181 | 0.617 |
| 0.03470034454201584 | 0.617 |
| 0.02322752466408351 | 0.617 |
| 0.011746664437486785 | 0.617 |
| 0.0002617209212549161 | 0.616 |
| -0.011223313956372287 | 0.616 |
| -0.0227044144289702 | 0.615 |
| -0.03417752195396105 | 0.613 |
| -0.04563854630587651 | 0.612 |
| -0.057083366701067326 | 0.61 |
| -0.06850783295406737 | 0.609 |
| -0.07990776666580962 | 0.606 |
| -0.09127896244388226 | 0.604 |
| -0.10261718915500223 | 0.602 |
| -0.11391819120987348 | 0.599 |
| -0.12517768988058553 | 0.596 |
| -0.13639138465069675 | 0.593 |
| -0.14755495459813453 | 0.59 |
| -0.15866405981103227 | 0.586 |
| -0.16971434283660997 | 0.582 |
| -0.18070143016319193 | 0.578 |
| -0.1916209337354412 | 0.574 |
| -0.2024684525028757 | 0.569 |
| -0.21323957400171664 | 0.565 |
| -0.22392987597010383 | 0.56 |
| -0.234534927996697 | 0.555 |
| -0.24505029320266544 | 0.55 |
| -0.25547152995705136 | 0.544 |
| -0.26579419362547513 | 0.538 |
| -0.27601383835213167 | 0.532 |
| -0.2861260188750094 | 0.526 |
| -0.29612629237424304 | 0.52 |
| -0.306010220353493 | 0.513 |
| -0.31577337055422117 | 0.507 |
| -0.32541131890271485 | 0.5 |
| -0.3349196514896866 | 0.493 |
| -0.3442939665822563 | 0.485 |
| -0.3535298766680983 | 0.478 |
| -0.362623010531514 | 0.47 |
| -0.371569015361164 | 0.462 |
| -0.3803635588891708 | 0.454 |
| -0.3890023315612765 | 0.446 |
| -0.39748104873771367 | 0.437 |
| -0.4057954529244204 | 0.428 |
| -0.41394131603420325 | 0.42 |
| -0.42191444167742337 | 0.411 |
| -0.4297106674817508 | 0.401 |
| -0.43732586744050395 | 0.392 |
| -0.4447559542890588 | 0.382 |
| -0.45199688190878184 | 0.373 |
| -0.45904464775790926 | 0.363 |
| -0.46589529532875995 | 0.353 |
| -0.4725449166306391 | 0.343 |
| -0.47898965469775184 | 0.332 |
| -0.4852257061214138 | 0.322 |
| -0.491249323605807 | 0.311 |
| -0.49705681854649464 | 0.301 |
| -0.5026445636308704 | 0.29 |
| -0.5080089954596781 | 0.279 |
| -0.5131466171887006 | 0.268 |
| -0.5180540011896747 | 0.257 |
| -0.5227277917294503 | 0.245 |
| -0.5271647076663678 | 0.234 |
| -0.5313615451627884 | 0.222 |
| -0.5353151804126655 | 0.21 |
| -0.5390225723830042 | 0.199 |
| -0.5424807655680101 | 0.187 |
| -0.5456868927546809 | 0.175 |
| -0.5486381777985527 | 0.163 |
| -0.5513319384082604 | 0.151 |
| -0.5537655889375265 | 0.139 |
| -0.5559366431831434 | 0.126 |
| -0.5578427171874653 | 0.114 |
| -0.5594815320438722 | 0.102 |
| -0.5608509167036225 | 0.089 |
| -0.5619488107824541 | 0.077 |
| -0.5627732673652435 | 0.064 |
| -0.5633224558069795 | 0.052 |
| -0.5635946645282516 | 0.039 |
| -0.5635883038034012 | 0.027 |
| -0.5633019085394259 | 0.014 |
| -0.5627341410436718 | 0.002 |
| -0.5618837937782928 | -0.011 |
| -0.5607497920993962 | -0.024 |
| -0.5593311969787381 | -0.036 |
| -0.5576272077057713 | -0.049 |
| -0.5556371645677908 | -0.061 |
| -0.5533605515058613 | -0.074 |
| -0.5507969987441509 | -0.086 |
| -0.5479462853902338 | -0.098 |
| -0.5448083420038659 | -0.111 |
| -0.541383253131671 | -0.123 |
| -0.5376712598051197 | -0.135 |
| -0.5336727619991131 | -0.148 |
| -0.529388321048429 | -0.16 |
| -0.524818662019218 | -0.172 |
| -0.5199646760326782 | -0.183 |
| -0.5148274225379742 | -0.195 |
| -0.5094081315314001 | -0.207 |
| -0.5037082057187245 | -0.219 |
| -0.49772922261759406 | -0.23 |
| -0.49147293659680463 | -0.241 |
| -0.48494128084919125 | -0.253 |
| -0.4781363692948213 | -0.264 |
| -0.47106049841111514 | -0.274 |
| -0.46371614898645636 | -0.285 |
| -0.4561059877937911 | -0.296 |
| -0.44823286918065647 | -0.306 |
| -0.440099836572017 | -0.316 |
| -0.4317101238822285 | -0.327 |
| -0.4230671568323907 | -0.336 |
| -0.41417455416929194 | -0.346 |
| -0.4050361287820925 | -0.355 |
| -0.39565588871283813 | -0.365 |
| -0.3860380380568408 | -0.374 |
| -0.3761869777489111 | -0.383 |
| -0.3661073062313762 | -0.391 |
| -0.35580381999976674 | -0.399 |
| -0.34528151402200885 | -0.408 |
| -0.33454558202691276 | -0.415 |
| -0.32360141665770403 | -0.423 |
| -0.31245460948630427 | -0.43 |
| -0.3011109508840273 | -0.437 |
| -0.2895764297443226 | -0.444 |
| -0.2778572330531629 | -0.45 |
| -0.2659597453026426 | -0.457 |
| -0.25389054774332764 | -0.463 |
| -0.24165641747087158 | -0.468 |
| -0.22926432634239366 | -0.473 |
| -0.21672143971809787 | -0.478 |
| -0.20403511502359875 | -0.483 |
| -0.19121290012841183 | -0.487 |
| -0.1782625315360627 | -0.491 |
| -0.16519193238126906 | -0.495 |
| -0.152009210229656 | -0.498 |
| -0.13872265467547568 | -0.501 |
| -0.1253407347328188 | -0.504 |
| -0.11187209601582718 | -0.506 |
| -0.09832555770344546 | -0.508 |
| -0.08471010928428328 | -0.51 |
| -0.07103490707720138 | -0.511 |
| -0.05730927052328218 | -0.512 |
| -0.04354267824490104 | -0.513 |
| -0.029744763867676757 | -0.513 |
| -0.015925311601150696 | -0.512 |
| -0.0020942515741226853 | -0.512 |
| 0.011738345079340747 | -0.511 |
| 0.025562271387113804 | -0.509 |
| 0.03936718996321682 | -0.508 |
| 0.05314263869268651 | -0.506 |
| 0.0668780366806524 | -0.503 |
| 0.08056269046902466 | -0.5 |
| 0.09418580052405187 | -0.497 |
| 0.10773646799784856 | -0.493 |
| 0.12120370176682273 | -0.489 |
| 0.1345764257497512 | -0.485 |
| 0.1478434865080557 | -0.48 |
| 0.16099366113062472 | -0.475 |
| 0.17401566540530483 | -0.469 |
| 0.1868981622789495 | -0.463 |
| 0.19962977060766357 | -0.457 |
| 0.2121990741986164 | -0.451 |
| 0.2245946311445168 | -0.443 |
| 0.23680498345154607 | -0.436 |
| 0.24881866696123256 | -0.428 |
| 0.26062422156642207 | -0.42 |
| 0.2722102017211507 | -0.412 |
| 0.28356518724386154 | -0.403 |
| 0.2946777944130235 | -0.394 |
| 0.30553668735380674 | -0.384 |
| 0.31613058971404884 | -0.374 |
| 0.32644829662730146 | -0.364 |
| 0.33647868696028643 | -0.354 |
| 0.3462107358416046 | -0.343 |
| 0.3556335274680371 | -0.332 |
| 0.3647362681842495 | -0.32 |
| 0.3735082998311605 | -0.309 |
| 0.38193911335766334 | -0.297 |
| 0.39001836268979023 | -0.284 |
| 0.39773587885079165 | -0.272 |
| 0.40508168432495517 | -0.259 |
| 0.41204600765731936 | -0.246 |
| 0.4186192982807423 | -0.233 |
| 0.4247922415610638 | -0.219 |
| 0.4305557740503529 | -0.206 |
| 0.43590109893745793 | -0.192 |
| 0.44081970168427725 | -0.178 |
| 0.44530336583534 | -0.163 |
| 0.4493441889874325 | -0.149 |
| 0.45293459890512294 | -0.135 |
| 0.4560673697671277 | -0.12 |
| 0.4587356385275245 | -0.105 |
| 0.4609329213748527 | -0.09 |
| 0.46265313027114635 | -0.075 |
| 0.46389058955192725 | -0.06 |
| 0.46464005256713303 | -0.045 |
| 0.464896718341882 | -0.03 |
| 0.4646562482348717 | -0.014 |
| 0.4639147825710782 | 0.001 |
| 0.46266895722426654 | 0.016 |
| 0.4609159201236413 | 0.031 |
| 0.45865334765775745 | 0.047 |
| 0.45587946094758064 | 0.062 |
| 0.45259304195933103 | 0.077 |
| 0.4487934494264661 | 0.092 |
| 0.44448063454886005 | 0.107 |
| 0.4396551564359172 | 0.121 |
| 0.4343181972590201 | 0.136 |
| 0.42847157707735883 | 0.151 |
| 0.42211776829981706 | 0.165 |
| 0.41525990974421034 | 0.179 |
| 0.4079018202537762 | 0.193 |
| 0.400048011829416 | 0.206 |
| 0.3917037022347792 | 0.22 |
| 0.38287482702987113 | 0.233 |
| 0.3735680509874554 | 0.246 |
| 0.3637907788451138 | 0.258 |
| 0.35355116534442965 | 0.27 |
| 0.3428581245073698 | 0.282 |
| 0.33172133809857035 | 0.294 |
| 0.32015126322087745 | 0.305 |
| 0.30815913899016767 | 0.316 |
| 0.29575699223417673 | 0.326 |
| 0.28295764215880315 | 0.336 |
| 0.2697747039241375 | 0.345 |
| 0.25622259107129697 | 0.354 |
| 0.24231651674003227 | 0.362 |
| 0.22807249361602397 | 0.37 |
| 0.21350733254580553 | 0.378 |
| 0.1986386397563518 | 0.385 |
| 0.18348481261555974 | 0.391 |
| 0.16806503386913582 | 0.397 |
| 0.15239926428879869 | 0.402 |
| 0.1365082336662194 | 0.406 |
| 0.12041343008676411 | 0.41 |
| 0.10413708741688923 | 0.414 |
| 0.08770217093897643 | 0.416 |
| 0.07113236106750154 | 0.418 |
| 0.05445203508071686 | 0.42 |
| 0.03768624680250844 | 0.42 |
| 0.020860704169781974 | 0.421 |
| 0.0040017446216495355 | 0.42 |
| -0.012863691752148788 | 0.419 |
| -0.029708091364732212 | 0.417 |
| -0.04650339864691832 | 0.414 |
| -0.06322104998085809 | 0.411 |
| -0.07983201010759525 | 0.407 |
| -0.09630681106102423 | 0.402 |
| -0.11261559367770838 | 0.397 |
| -0.12872815172862534 | 0.391 |
| -0.14461397871510917 | 0.384 |
| -0.160242317367032 | 0.376 |
| -0.1755822118765916 | 0.368 |
| -0.19060256289591632 | 0.359 |
| -0.20527218532104302 | 0.35 |
| -0.21955986887863818 | 0.34 |
| -0.23343444152509257 | 0.329 |
| -0.2468648356602978 | 0.318 |
| -0.2598201571504799 | 0.306 |
| -0.27226975714589563 | 0.293 |
| -0.28418330666996044 | 0.28 |
| -0.2955308739464467 | 0.266 |
| -0.30628300442073797 | 0.252 |
| -0.3164108034197222 | 0.237 |
| -0.3258860213827254 | 0.222 |
| -0.3346811415829013 | 0.206 |
| -0.3427694702446765 | 0.19 |
| -0.35012522894817544 | 0.173 |
| -0.35672364919599775 | 0.156 |
| -0.36254106900126415 | 0.139 |
| -0.36755503133846745 | 0.121 |
| -0.3717443842803472 | 0.103 |
| -0.3750893826247301 | 0.085 |
| -0.37757179079503583 | 0.067 |
| -0.37917498677692607 | 0.049 |
| -0.37988406683137693 | 0.03 |
| -0.3796859507012711 | 0.011 |
| -0.3785694870044537 | -0.007 |
| -0.376525558481078 | -0.026 |
| -0.3735471867370087 | -0.045 |
| -0.36962963609807575 | -0.063 |
| -0.36477051616211614 | -0.081 |
| -0.35896988260705154 | -0.099 |
| -0.3522303357837804 | -0.117 |
| -0.34455711659248217 | -0.135 |
| -0.3359581991101196 | -0.152 |
| -0.3264443794055768 | -0.169 |
| -0.3160293599470987 | -0.185 |
| -0.30472982897462414 | -0.201 |
| -0.2925655341773847 | -0.216 |
| -0.2795593499849326 | -0.231 |
| -0.2657373377477597 | -0.245 |
| -0.2511287980520833 | -0.258 |
| -0.23576631438244744 | -0.27 |
| -0.21968578731578076 | -0.282 |
| -0.20292645840176954 | -0.293 |
| -0.18553092285716702 | -0.302 |
| -0.16754513017633993 | -0.311 |
| -0.14901837173734592 | -0.319 |
| -0.13000325446258362 | -0.326 |
| -0.1105556595760428 | -0.331 |
| -0.09073468548592974 | -0.336 |
| -0.07060257381252834 | -0.34 |
| -0.05022461757719858 | -0.342 |
| -0.02966905057008694 | -0.343 |
| -0.009006916922151616 | -0.343 |
| 0.011688080077728619 | -0.341 |
| 0.03233975085665239 | -0.338 |
| 0.05286961502667964 | -0.335 |
| 0.07319712031114425 | -0.329 |
| 0.09323988573786295 | -0.323 |
| 0.11291396984422228 | -0.315 |
| 0.13213416456149837 | -0.306 |
| 0.15081431535391052 | -0.296 |
| 0.1688676680805917 | -0.284 |
| 0.1862072429245907 | -0.271 |
| 0.20274623559087307 | -0.257 |
| 0.21839844581370155 | -0.242 |
| 0.2330787330313628 | -0.226 |
| 0.24670349888156834 | -0.209 |
| 0.2591911959425991 | -0.191 |
| 0.27046286189200924 | -0.172 |
| 0.28044267797512423 | -0.152 |
| 0.289058550368396 | -0.131 |
| 0.29624271268675023 | -0.11 |
| 0.30193234751833964 | -0.088 |
| 0.30607022447375104 | -0.066 |
| 0.3086053518090544 | -0.044 |
| 0.3094936382227748 | -0.021 |
| 0.3086985609358779 | 0.002 |
| 0.3061918356415669 | 0.025 |
| 0.30195408335895657 | 0.048 |
| 0.2959754886429519 | 0.07 |
| 0.2882564429940239 | 0.092 |
| 0.2788081666789341 | 0.114 |
| 0.2676533015206078 | 0.135 |
| 0.2548264665471269 | 0.155 |
| 0.24037476771222951 | 0.174 |
| 0.2243582522201275 | 0.192 |
| 0.20685029731476673 | 0.208 |
| 0.18793792273844082 | 0.223 |
| 0.1677220154393956 | 0.237 |
| 0.1463174545272996 | 0.249 |
| 0.12385312395607023 | 0.259 |
| 0.10047179997491557 | 0.267 |
| 0.07632990005267001 | 0.274 |
| 0.05159707977257609 | 0.278 |
| 0.026455664142689652 | 0.28 |
| 0.0010998999023988827 | 0.279 |
| -0.024264984237168174 | 0.276 |
| -0.049423921863734864 | 0.271 |
| -0.07415336917151086 | 0.264 |
| -0.09822289156687528 | 0.254 |
| -0.1213969851741974 | 0.242 |
| -0.1434371397408538 | 0.228 |
| -0.1641041468411708 | 0.211 |
| -0.18316065413013347 | 0.193 |
| -0.20037396264608387 | 0.172 |
| -0.21551905975572408 | 0.15 |
| -0.228381875226522 | 0.126 |
| -0.23876274205905937 | 0.101 |
| -0.24648003708189073 | 0.075 |
| -0.2513739688836504 | 0.047 |
| -0.2533104724279728 | 0.019 |
| -0.25218516068494634 | -0.009 |
| -0.24792727386512706 | -0.036 |
| -0.2405035564405391 | -0.064 |
| -0.22992198120649426 | -0.091 |
| -0.2162352283551495 | -0.116 |
| -0.19954381613452685 | -0.14 |
| -0.1799987684649013 | -0.162 |
| -0.15780369426994156 | -0.181 |
| -0.13321614373753585 | -0.198 |
| -0.10654809884240576 | -0.211 |
| -0.07816544993819237 | -0.221 |
| -0.048486307876526365 | -0.228 |
| -0.017978002869328633 | -0.23 |
| 0.012847371772429738 | -0.229 |
| 0.04343899966331929 | -0.223 |
| 0.0732150730033352 | -0.214 |
| 0.10157229416331975 | -0.2 |
| 0.1278971858306525 | -0.182 |
| 0.15157919744984286 | -0.16 |
| 0.17202553256830982 | -0.135 |
| 0.18867754569125608 | -0.107 |
| 0.20102846818799489 | -0.076 |
| 0.20864212118258377 | -0.044 |
| 0.21117216061907207 | -0.011 |
| 0.20838127839212317 | 0.023 |
| 0.2001596575828852 | 0.056 |
| 0.18654185513789148 | 0.088 |
| 0.16772116940308282 | 0.117 |
| 0.14406045249219676 | 0.143 |
| 0.11609826037094147 | 0.164 |
| 0.0845492105899002 | 0.18 |
| 0.050297454164681704 | 0.191 |
| 0.014382280321789148 | 0.195 |
| -0.022024923591074524 | 0.193 |
| -0.05765282623094554 | 0.184 |
| -0.09117146702784512 | 0.168 |
| -0.12124223945749579 | 0.146 |
| -0.14657540393735471 | 0.118 |
| -0.1659932582485508 | 0.085 |
| -0.17849631142440206 | 0.049 |
| -0.18332903213789545 | 0.01 |
| -0.18004104879581423 | -0.028 |
| -0.1685391556689074 | -0.066 |
| -0.14912522740013245 | -0.1 |
| -0.1225152635116846 | -0.13 |
| -0.0898353622952386 | -0.153 |
| -0.05259151701708969 | -0.168 |
| -0.01261174592183159 | -0.175 |
| 0.02803884443517357 | -0.172 |
| 0.0671670370204005 | -0.16 |
| 0.10257894330175893 | -0.139 |
| 0.13221791604237043 | -0.11 |
| 0.15430300376886397 | -0.075 |
| 0.1674568461945131 | -0.036 |
| 0.17081177863768418 | 0.006 |
| 0.16408397547864506 | 0.047 |
| 0.1476077252603677 | 0.085 |
| 0.12232522889864395 | 0.119 |
| 0.08973131767257098 | 0.145 |
| 0.051776741377040275 | 0.162 |
| 0.010737658967216776 | 0.17 |
| -0.030937826710819058 | 0.168 |
| -0.07079321161702462 | 0.156 |
| -0.10652370115686048 | 0.135 |
| -0.13612018706690285 | 0.106 |
| -0.15798647013839057 | 0.071 |
| -0.17102213689741994 | 0.032 |
| -0.17466704913352465 | -0.009 |
| -0.1689070273952292 | -0.049 |
| -0.15424359527684692 | -0.086 |
| -0.13163328758456364 | -0.12 |
| -0.10240382346429788 | -0.147 |
| -0.06815534541538355 | -0.167 |
| -0.030654980406097335 | -0.179 |
| 0.00826767176813651 | -0.183 |
| 0.046817687071162024 | -0.178 |
| 0.08331965005725876 | -0.166 |
| 0.11628682199662149 | -0.147 |
| 0.14447285715631716 | -0.121 |
| 0.16690567836958548 | -0.091 |
| 0.18290427975109141 | -0.057 |
| 0.19208010195151495 | -0.022 |
| 0.1943252195047322 | 0.015 |
| 0.18978991127458328 | 0.051 |
| 0.1788522905622103 | 0.085 |
| 0.1620825962481286 | 0.117 |
| 0.1402045376579083 | 0.145 |
| 0.11405578842057423 | 0.168 |
| 0.08454937778777137 | 0.187 |
| 0.05263736409994322 | 0.2 |
| 0.01927781931028545 | 0.208 |
| -0.014594176414644958 | 0.21 |
| -0.04809112345479399 | 0.207 |
| -0.08039311705212078 | 0.198 |
| -0.11076333235302921 | 0.185 |
| -0.13855918356646577 | 0.168 |
| -0.1632394772586544 | 0.146 |
| -0.18436795936894187 | 0.122 |
| -0.20161370323973113 | 0.095 |
| -0.21474880722666964 | 0.066 |
| -0.22364387056575993 | 0.036 |
| -0.22826170001126833 | 0.005 |
| -0.22864967168644323 | -0.026 |
| -0.22493113637780088 | -0.056 |
| -0.21729621531229848 | -0.086 |
| -0.2059922898550084 | -0.114 |
| -0.19131444457877597 | -0.14 |
| -0.1735960803275894 | -0.164 |
| -0.15319987334299773 | -0.186 |
| -0.13050921901505297 | -0.204 |
| -0.10592026483238573 | -0.22 |
| -0.07983460688382259 | -0.233 |
| -0.05265269786881056 | -0.242 |
| -0.024767991931504484 | -0.248 |
| 0.0034381674296472334 | -0.251 |
| 0.03160092584982998 | -0.251 |
| 0.05937558512686111 | -0.248 |
| 0.08644059085765353 | -0.241 |
| 0.11249988023759513 | -0.232 |
| 0.1372846349433104 | -0.221 |
| 0.16055448755747304 | -0.207 |
| 0.18209823198473407 | -0.19 |
| 0.20173408900756568 | -0.172 |
| 0.21930957777320118 | -0.152 |
| 0.23470104279658618 | -0.13 |
| 0.24781288419365435 | -0.107 |
| 0.25857653648507456 | -0.083 |
| 0.266949238571442 | -0.059 |
| 0.27291263449466785 | -0.033 |
| 0.2764712414662235 | -0.008 |
| 0.2776508184431305 | 0.018 |
| 0.2764966653342801 | 0.043 |
| 0.27307187977664277 | 0.068 |
| 0.2674555953754225 | 0.093 |
| 0.25974122238644515 | 0.116 |
| 0.250034709056722 | 0.139 |
| 0.2384528392466367 | 0.161 |
| 0.2251215795449572 | 0.182 |
| 0.21017448686126441 | 0.201 |
| 0.1937511854407311 | 0.219 |
| 0.17599592039151304 | 0.236 |
| 0.1570561931407961 | 0.25 |
| 0.1370814827352559 | 0.264 |
| 0.1162220555673331 | 0.275 |
| 0.09462786493126593 | 0.285 |
| 0.0724475407825066 | 0.293 |
| 0.04982746918084645 | 0.299 |
| 0.026910960130977917 | 0.304 |
| 0.0038375018840645127 | 0.306 |
| -0.019257900779917164 | 0.307 |
| -0.04224530721653956 | 0.306 |
| -0.06500034381553584 | 0.304 |
| -0.08740463270304265 | 0.3 |
| -0.10934615002889947 | 0.294 |
| -0.13071951777059176 | 0.287 |
| -0.15142623308107842 | 0.278 |
| -0.17137483925571223 | 0.268 |
| -0.19048104240003702 | 0.257 |
| -0.20866777785118598 | 0.244 |
| -0.22586523034617106 | 0.23 |
| -0.2420108118453086 | 0.215 |
| -0.2570491008126819 | 0.199 |
| -0.27093174663176794 | 0.183 |
| -0.28361734269661804 | 0.165 |
| -0.29507127157036495 | 0.147 |
| -0.30526552544606506 | 0.128 |
| -0.3141785049823781 | 0.108 |
| -0.32179479942045003 | 0.088 |
| -0.32810495072042895 | 0.068 |
| -0.33310520428789686 | 0.048 |
| -0.3367972486935024 | 0.027 |
| -0.33918794662438395 | 0.006 |
| -0.34028905914455543 | -0.015 |
| -0.3401169651840917 | -0.035 |
| -0.3386923780243576 | -0.056 |
| -0.336040060399205 | -0.077 |
| -0.3321885396904232 | -0.097 |
| -0.32716982456008775 | -0.117 |
| -0.3210191242330201 | -0.136 |
| -0.313774571519501 | -0.155 |
| -0.30547695055173296 | -0.173 |
| -0.29616943009734925 | -0.191 |
| -0.28589730320947454 | -0.209 |
| -0.27470773387538094 | -0.225 |
| -0.2626495112345383 | -0.241 |
| -0.2497728118516836 | -0.256 |